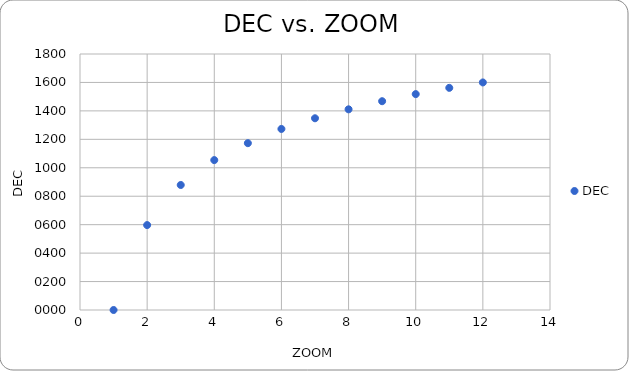
| Category | DEC |
|---|---|
| 1.0 | 0 |
| 2.0 | 597 |
| 3.0 | 879 |
| 4.0 | 1054 |
| 5.0 | 1173 |
| 6.0 | 1273 |
| 7.0 | 1348 |
| 8.0 | 1411 |
| 9.0 | 1468 |
| 10.0 | 1518 |
| 11.0 | 1562 |
| 12.0 | 1600 |